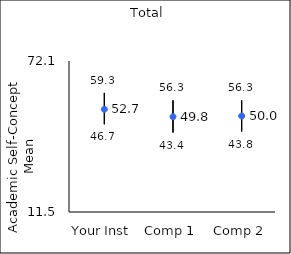
| Category | 25th percentile | 75th percentile | Mean |
|---|---|---|---|
| Your Inst | 46.7 | 59.3 | 52.73 |
| Comp 1 | 43.4 | 56.3 | 49.76 |
| Comp 2 | 43.8 | 56.3 | 50.02 |